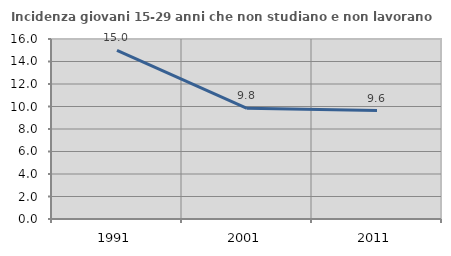
| Category | Incidenza giovani 15-29 anni che non studiano e non lavorano  |
|---|---|
| 1991.0 | 14.995 |
| 2001.0 | 9.836 |
| 2011.0 | 9.639 |